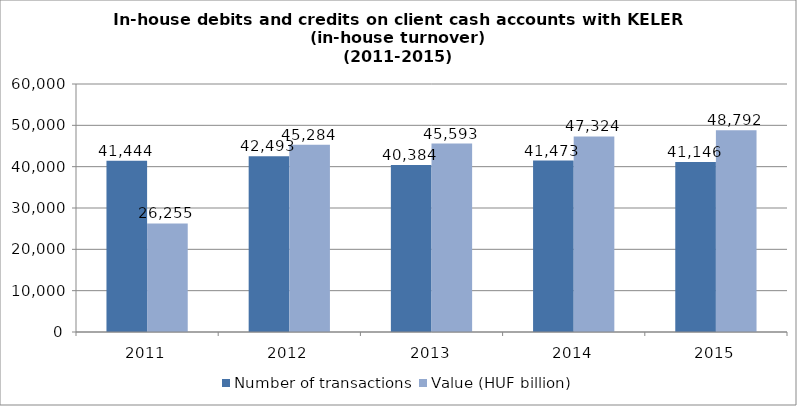
| Category | Number of transactions | Value (HUF billion) |
|---|---|---|
| 2011.0 | 41444 | 26255 |
| 2012.0 | 42493 | 45284 |
| 2013.0 | 40384 | 45593 |
| 2014.0 | 41473 | 47324 |
| 2015.0 | 41146 | 48792 |